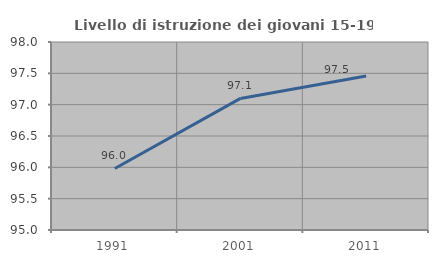
| Category | Livello di istruzione dei giovani 15-19 anni |
|---|---|
| 1991.0 | 95.982 |
| 2001.0 | 97.1 |
| 2011.0 | 97.457 |